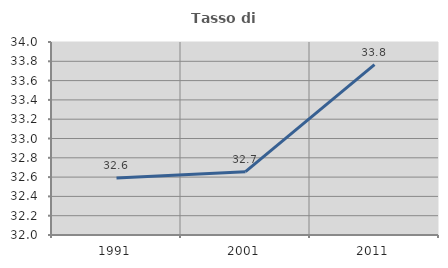
| Category | Tasso di occupazione   |
|---|---|
| 1991.0 | 32.591 |
| 2001.0 | 32.656 |
| 2011.0 | 33.766 |